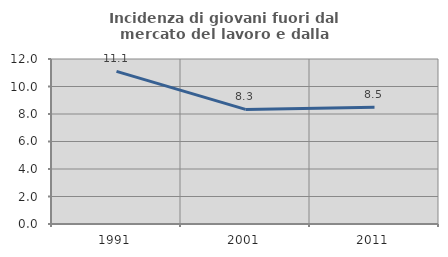
| Category | Incidenza di giovani fuori dal mercato del lavoro e dalla formazione  |
|---|---|
| 1991.0 | 11.096 |
| 2001.0 | 8.333 |
| 2011.0 | 8.498 |